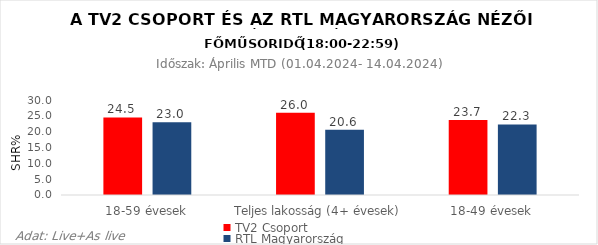
| Category | TV2 Csoport | RTL Magyarország |
|---|---|---|
| 18-59 évesek | 24.5 | 23 |
| Teljes lakosság (4+ évesek) | 26 | 20.6 |
| 18-49 évesek | 23.7 | 22.3 |